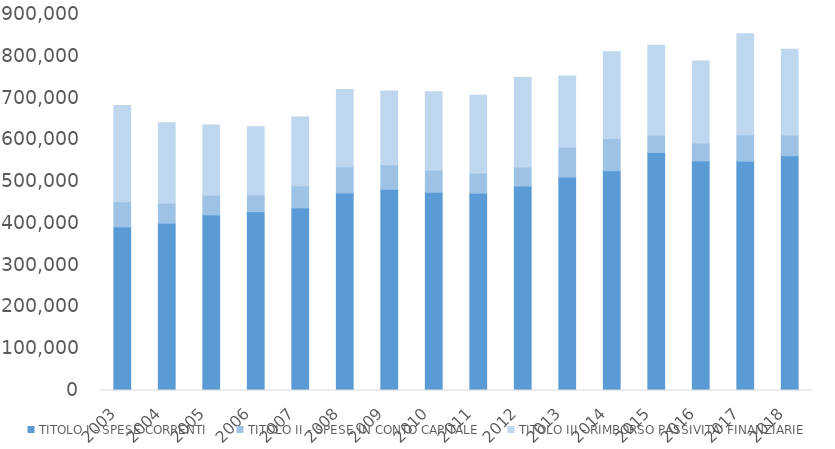
| Category | TITOLO I - SPESE CORRENTI | TITOLO II - SPESE IN CONTO CAPITALE | TITOLO III - RIMBORSO PASSIVITA' FINANZIARIE |
|---|---|---|---|
| 2003.0 | 391593 | 60035 | 230794 |
| 2004.0 | 400561 | 47364 | 192929 |
| 2005.0 | 420449 | 46794 | 168313 |
| 2006.0 | 428139 | 39854 | 163620 |
| 2007.0 | 437189 | 53157 | 164199 |
| 2008.0 | 472685.151 | 63051.551 | 184807.79 |
| 2009.0 | 481578.263 | 58913.343 | 176141.241 |
| 2010.0 | 474662.182 | 52282.257 | 188435.487 |
| 2011.0 | 472319.774 | 48502.102 | 186135.302 |
| 2012.0 | 489350.589 | 45653.028 | 214333.651 |
| 2013.0 | 510835.178 | 71174.832 | 170972.576 |
| 2014.0 | 526195.115 | 76830.108 | 207562.179 |
| 2015.0 | 569801.099 | 41309.734 | 215519.974 |
| 2016.0 | 549647.209 | 42794.164 | 195981.732 |
| 2017.0 | 548889.873 | 63180.565 | 242072.352 |
| 2018.0 | 561969.187 | 49628.079 | 205104.26 |